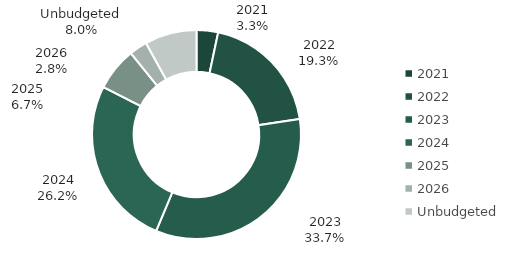
| Category | % of Budget |
|---|---|
| 2021 | 0.033 |
| 2022 | 0.193 |
| 2023 | 0.337 |
| 2024 | 0.262 |
| 2025 | 0.067 |
| 2026 | 0.028 |
| Unbudgeted | 0.08 |